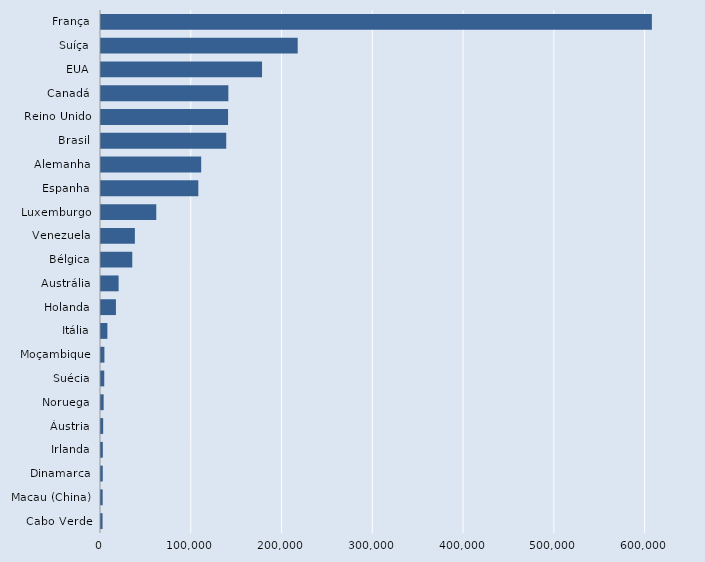
| Category | Series 0 |
|---|---|
| Cabo Verde | 1716 |
| Macau (China) | 1835 |
| Dinamarca | 1943 |
| Irlanda | 2033 |
| Áustria | 2394 |
| Noruega | 2925 |
| Suécia | 3583 |
| Moçambique | 3767 |
| Itália | 7023 |
| Holanda | 16456 |
| Austrália | 19400 |
| Bélgica | 34455 |
| Venezuela | 37326 |
| Luxemburgo | 60897 |
| Espanha | 107226 |
| Alemanha | 110384 |
| Brasil | 137973 |
| Reino Unido | 140000 |
| Canadá | 140310 |
| EUA | 177431 |
| Suíça | 216714 |
| França | 606897 |